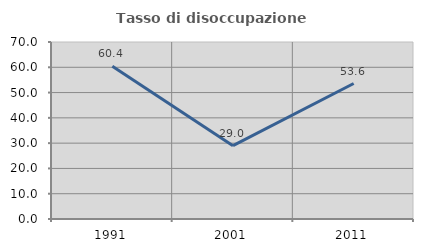
| Category | Tasso di disoccupazione giovanile  |
|---|---|
| 1991.0 | 60.39 |
| 2001.0 | 28.986 |
| 2011.0 | 53.571 |